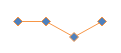
| Category | Series 0 |
|---|---|
| 0 | 1 |
| 1 | 1 |
| 2 | 0 |
| 3 | 1 |